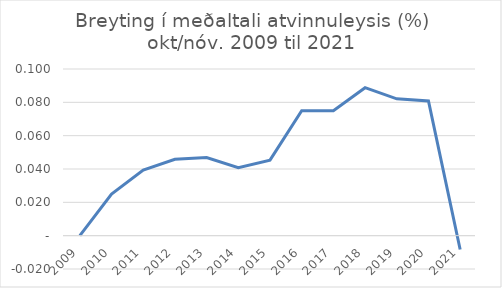
| Category | Series 0 |
|---|---|
| 2009.0 | 0 |
| 2010.0 | 0.025 |
| 2011.0 | 0.039 |
| 2012.0 | 0.046 |
| 2013.0 | 0.047 |
| 2014.0 | 0.041 |
| 2015.0 | 0.045 |
| 2016.0 | 0.075 |
| 2017.0 | 0.075 |
| 2018.0 | 0.089 |
| 2019.0 | 0.082 |
| 2020.0 | 0.081 |
| 2021.0 | -0.008 |